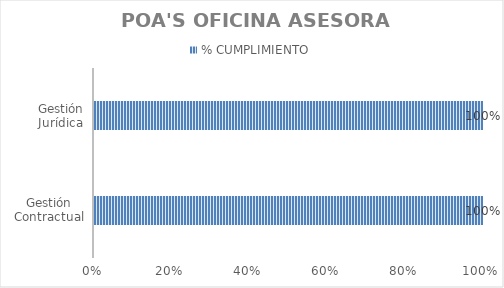
| Category | % CUMPLIMIENTO |
|---|---|
| Gestión Contractual | 1 |
| Gestión Jurídica | 1 |